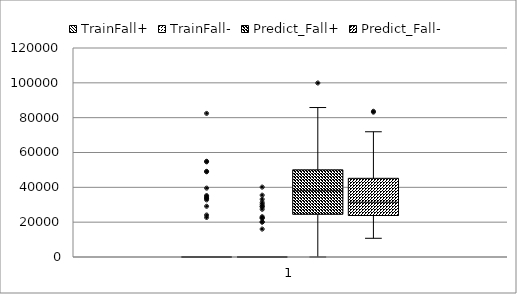
| Category | Fall+ | Fall- |
|---|---|---|
| 65< | 38052.471 | 28748.714 |
| 65..70 | 34036.172 | 31162.143 |
| 70..75 | 43875.138 | 36299.103 |
| 75..80 | 40206.04 | 36640.727 |
| 80..85 | 44875.652 | 37100.318 |
| >85 | 47768.909 | 45608.444 |